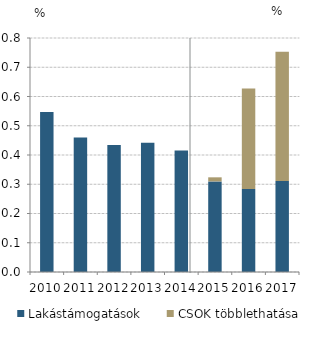
| Category | Lakástámogatások | CSOK többlethatása |
|---|---|---|
| 2010.0 | 0.547 | 0 |
| 2011.0 | 0.46 | 0 |
| 2012.0 | 0.434 | 0 |
| 2013.0 | 0.442 | 0 |
| 2014.0 | 0.415 | 0 |
| 2015.0 | 0.31 | 0.014 |
| 2016.0 | 0.284 | 0.344 |
| 2017.0 | 0.311 | 0.442 |